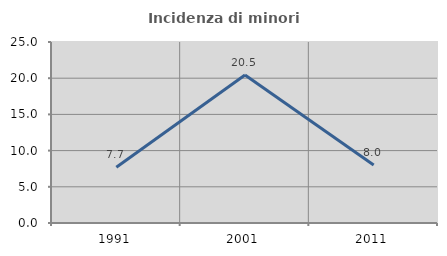
| Category | Incidenza di minori stranieri |
|---|---|
| 1991.0 | 7.692 |
| 2001.0 | 20.455 |
| 2011.0 | 8 |